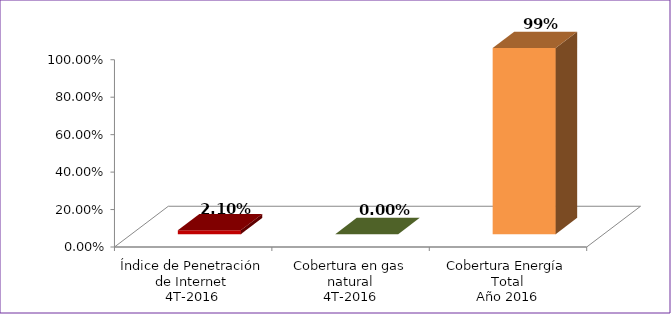
| Category | Series 0 |
|---|---|
| Índice de Penetración de Internet
4T-2016 | 0.021 |
| Cobertura en gas natural
4T-2016 | 0 |
| Cobertura Energía Total
Año 2016 | 0.994 |